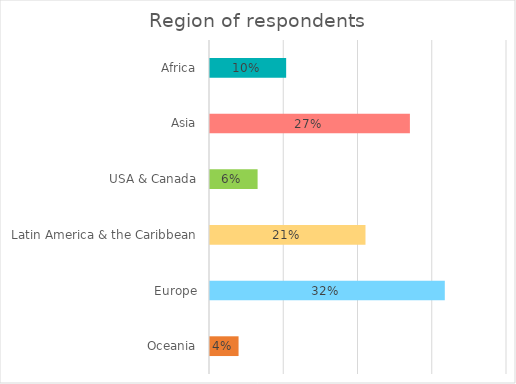
| Category | % |
|---|---|
| Africa | 10.256 |
| Asia | 26.923 |
| USA & Canada | 6.41 |
| Latin America & the Caribbean | 20.94 |
| Europe | 31.624 |
| Oceania | 3.846 |